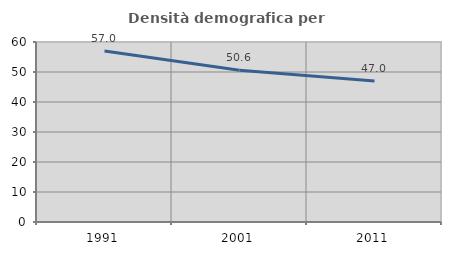
| Category | Densità demografica |
|---|---|
| 1991.0 | 57 |
| 2001.0 | 50.564 |
| 2011.0 | 46.998 |